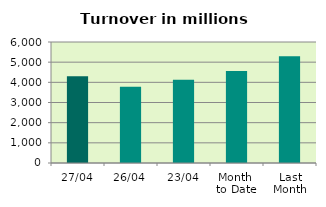
| Category | Series 0 |
|---|---|
| 27/04 | 4295.715 |
| 26/04 | 3781.66 |
| 23/04 | 4129.297 |
| Month 
to Date | 4555.982 |
| Last
Month | 5289.077 |